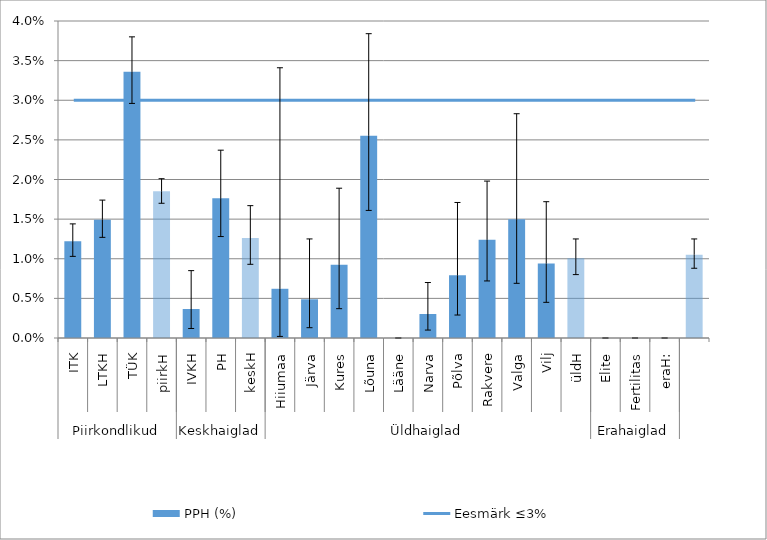
| Category | PPH (%) |
|---|---|
| 0 | 0.012 |
| 1 | 0.015 |
| 2 | 0.034 |
| 3 | 0.019 |
| 4 | 0.004 |
| 5 | 0.018 |
| 6 | 0.013 |
| 7 | 0.006 |
| 8 | 0.005 |
| 9 | 0.009 |
| 10 | 0.026 |
| 11 | 0 |
| 12 | 0.003 |
| 13 | 0.008 |
| 14 | 0.012 |
| 15 | 0.015 |
| 16 | 0.009 |
| 17 | 0.01 |
| 18 | 0 |
| 19 | 0 |
| 20 | 0 |
| 21 | 0.011 |